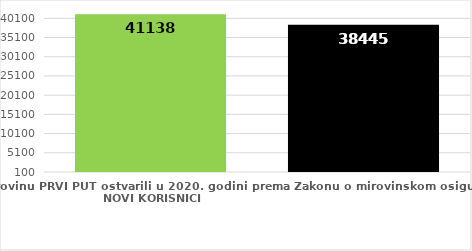
| Category | broj korisnika |
|---|---|
| Korisnici koji su pravo na mirovinu PRVI PUT ostvarili u 2020. godini prema Zakonu o mirovinskom osiguranju - NOVI KORISNICI | 41138 |
| Korisnici mirovina kojima je u 2020. godini PRESTALO PRAVO NA MIROVINU - uzrok smrt 
koji su pravo na mirovinu ostvarili prema Zakonu o mirovinskom osiguranju | 38445 |